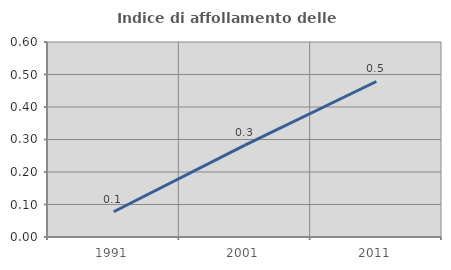
| Category | Indice di affollamento delle abitazioni  |
|---|---|
| 1991.0 | 0.078 |
| 2001.0 | 0.283 |
| 2011.0 | 0.478 |